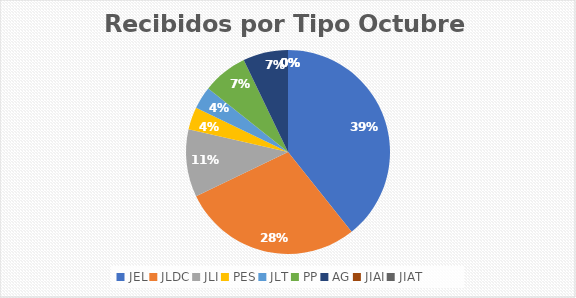
| Category | Series 0 |
|---|---|
| JEL | 11 |
| JLDC | 8 |
| JLI | 3 |
| PES | 1 |
| JLT | 1 |
| PP | 2 |
| AG | 2 |
| JIAI | 0 |
| JIAT | 0 |